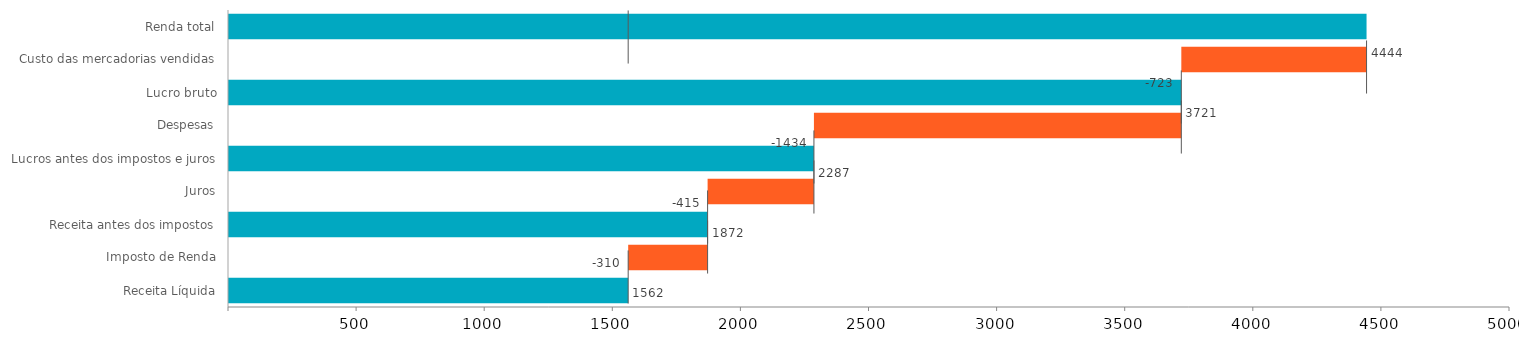
| Category | Final | Em branco | PerdaNeg | GanhoNeg | PerdaPos | GanhoPos |
|---|---|---|---|---|---|---|
| Renda total | 4444 | 0 | 0 | 0 | 0 | 0 |
| Custo das mercadorias vendidas | 0 | 3721 | 0 | 0 | 723 | 0 |
| Lucro bruto | 3721 | 0 | 0 | 0 | 0 | 0 |
| Despesas | 0 | 2287 | 0 | 0 | 1434 | 0 |
| Lucros antes dos impostos e juros | 2287 | 0 | 0 | 0 | 0 | 0 |
| Juros | 0 | 1872 | 0 | 0 | 415 | 0 |
| Receita antes dos impostos | 1872 | 0 | 0 | 0 | 0 | 0 |
| Imposto de Renda | 0 | 1562 | 0 | 0 | 310 | 0 |
| Receita Líquida | 1562 | 0 | 0 | 0 | 0 | 0 |